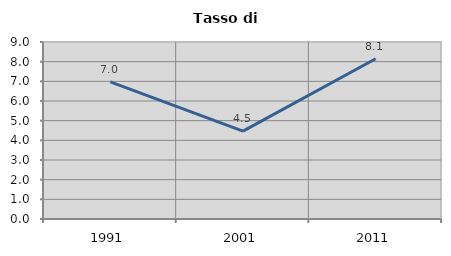
| Category | Tasso di disoccupazione   |
|---|---|
| 1991.0 | 6.977 |
| 2001.0 | 4.469 |
| 2011.0 | 8.148 |